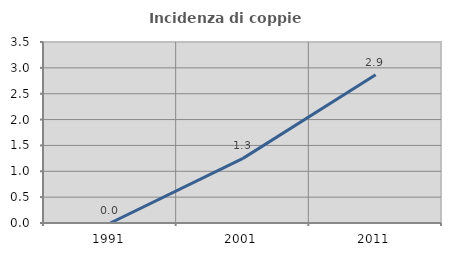
| Category | Incidenza di coppie miste |
|---|---|
| 1991.0 | 0 |
| 2001.0 | 1.25 |
| 2011.0 | 2.868 |